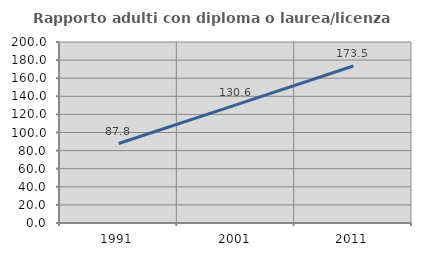
| Category | Rapporto adulti con diploma o laurea/licenza media  |
|---|---|
| 1991.0 | 87.831 |
| 2001.0 | 130.578 |
| 2011.0 | 173.493 |